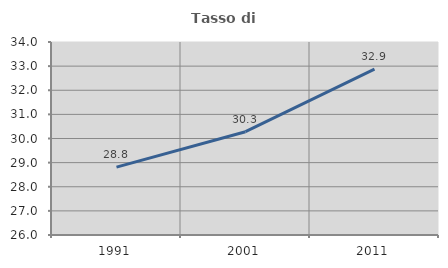
| Category | Tasso di occupazione   |
|---|---|
| 1991.0 | 28.814 |
| 2001.0 | 30.283 |
| 2011.0 | 32.872 |